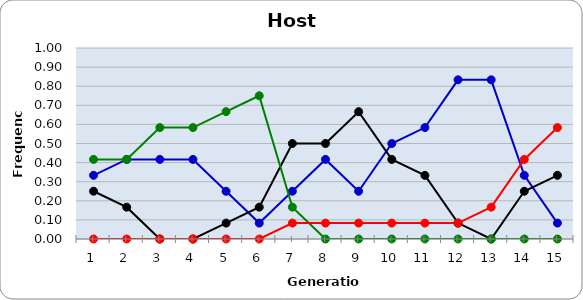
| Category | Sp | Cl | Di | He |
|---|---|---|---|---|
| 1.0 | 0.333 | 0.25 | 0.417 | 0 |
| 2.0 | 0.417 | 0.167 | 0.417 | 0 |
| 3.0 | 0.417 | 0 | 0.583 | 0 |
| 4.0 | 0.417 | 0 | 0.583 | 0 |
| 5.0 | 0.25 | 0.083 | 0.667 | 0 |
| 6.0 | 0.083 | 0.167 | 0.75 | 0 |
| 7.0 | 0.25 | 0.5 | 0.167 | 0.083 |
| 8.0 | 0.417 | 0.5 | 0 | 0.083 |
| 9.0 | 0.25 | 0.667 | 0 | 0.083 |
| 10.0 | 0.5 | 0.417 | 0 | 0.083 |
| 11.0 | 0.583 | 0.333 | 0 | 0.083 |
| 12.0 | 0.833 | 0.083 | 0 | 0.083 |
| 13.0 | 0.833 | 0 | 0 | 0.167 |
| 14.0 | 0.333 | 0.25 | 0 | 0.417 |
| 15.0 | 0.083 | 0.333 | 0 | 0.583 |